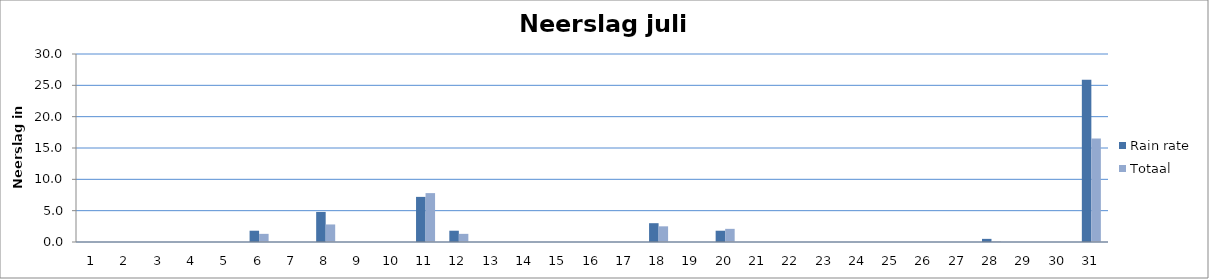
| Category | Rain rate | Totaal |
|---|---|---|
| 0 | 0 | 0 |
| 1 | 0 | 0 |
| 2 | 0 | 0 |
| 3 | 0 | 0 |
| 4 | 0 | 0 |
| 5 | 1.8 | 1.3 |
| 6 | 0 | 0 |
| 7 | 4.8 | 2.8 |
| 8 | 0 | 0 |
| 9 | 0 | 0 |
| 10 | 7.2 | 7.8 |
| 11 | 1.8 | 1.3 |
| 12 | 0 | 0 |
| 13 | 0 | 0 |
| 14 | 0 | 0 |
| 15 | 0 | 0 |
| 16 | 0 | 0 |
| 17 | 3 | 2.5 |
| 18 | 0 | 0 |
| 19 | 1.8 | 2.1 |
| 20 | 0 | 0 |
| 21 | 0 | 0 |
| 22 | 0 | 0 |
| 23 | 0 | 0 |
| 24 | 0 | 0 |
| 25 | 0 | 0 |
| 26 | 0 | 0 |
| 27 | 0.5 | 0.1 |
| 28 | 0 | 0 |
| 29 | 0 | 0 |
| 30 | 25.9 | 16.5 |